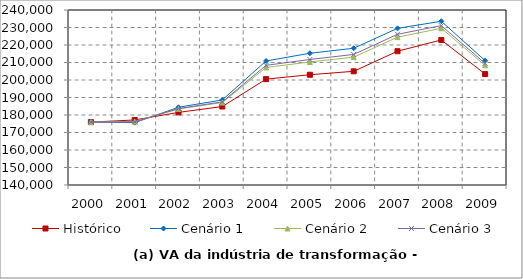
| Category | Histórico | Cenário 1 | Cenário 2 | Cenário 3 |
|---|---|---|---|---|
| 2000.0 | 175934 | 175934 | 175934 | 175934 |
| 2001.0 | 177166 | 175619.48 | 176299.656 | 176103.443 |
| 2002.0 | 181483.154 | 184422.54 | 183418.144 | 183702.548 |
| 2003.0 | 184845.331 | 188609.983 | 187114.492 | 187523.21 |
| 2004.0 | 200502.646 | 210873.014 | 207163.267 | 208390.491 |
| 2005.0 | 203007.183 | 215293.523 | 210296.88 | 211712.365 |
| 2006.0 | 204966.625 | 218134.936 | 213042.902 | 214611.195 |
| 2007.0 | 216453.646 | 229517.596 | 224482.049 | 226132.437 |
| 2008.0 | 222875.273 | 233580.067 | 229564.879 | 231064.503 |
| 2009.0 | 203410.054 | 211100.822 | 208394.739 | 209496.822 |